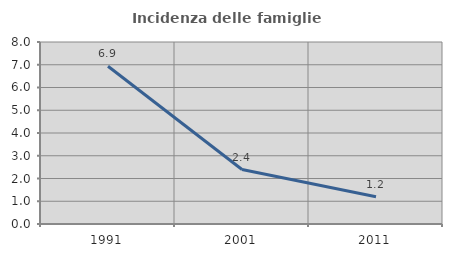
| Category | Incidenza delle famiglie numerose |
|---|---|
| 1991.0 | 6.935 |
| 2001.0 | 2.393 |
| 2011.0 | 1.198 |